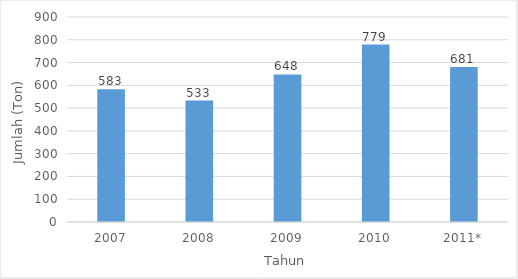
| Category | Series 0 |
|---|---|
| 2007 | 583 |
| 2008 | 533 |
| 2009 | 648 |
| 2010 | 779 |
| 2011* | 681 |